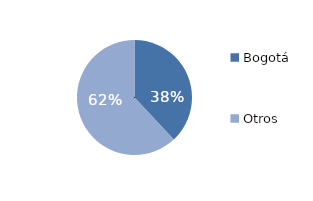
| Category | Series 0 |
|---|---|
| Bogotá | 38.04 |
| Otros | 61.96 |